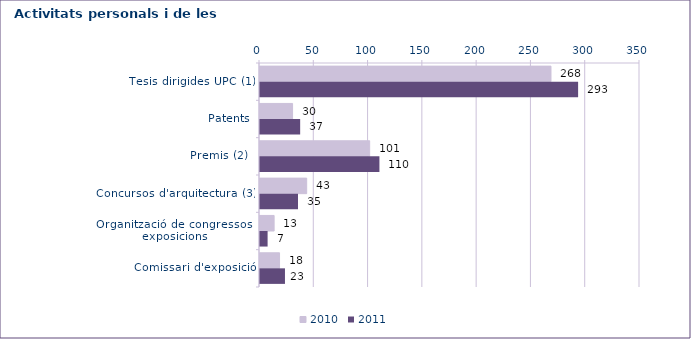
| Category | 2010 | 2011 |
|---|---|---|
| Tesis dirigides UPC (1) | 268 | 293 |
| Patents | 30 | 37 |
| Premis (2)  | 101 | 110 |
| Concursos d'arquitectura (3) | 43 | 35 |
| Organització de congressos i exposicions | 13 | 7 |
| Comissari d'exposició | 18 | 23 |